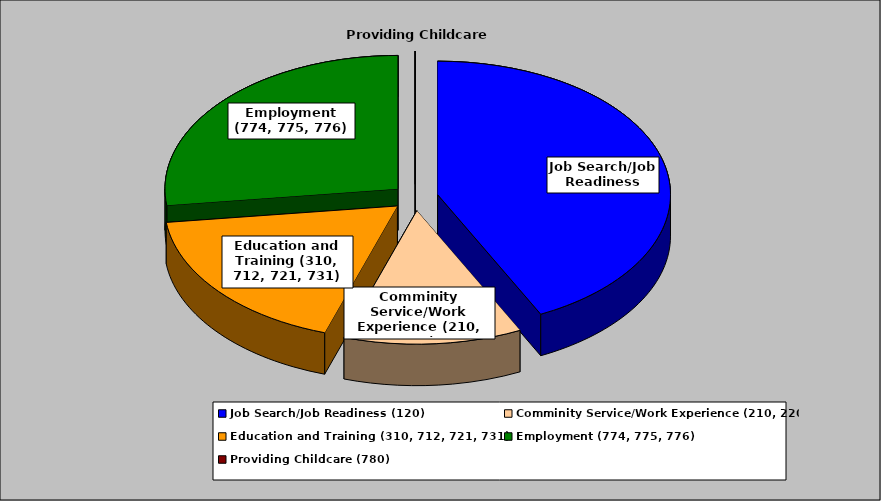
| Category | Series 0 |
|---|---|
| Job Search/Job Readiness (120) | 0.427 |
| Comminity Service/Work Experience (210, 220) | 0.124 |
| Education and Training (310, 712, 721, 731) | 0.18 |
| Employment (774, 775, 776) | 0.27 |
| Providing Childcare (780) | 0 |